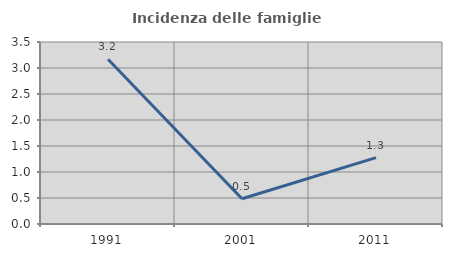
| Category | Incidenza delle famiglie numerose |
|---|---|
| 1991.0 | 3.169 |
| 2001.0 | 0.485 |
| 2011.0 | 1.276 |